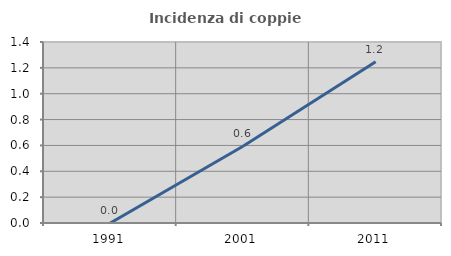
| Category | Incidenza di coppie miste |
|---|---|
| 1991.0 | 0 |
| 2001.0 | 0.593 |
| 2011.0 | 1.247 |